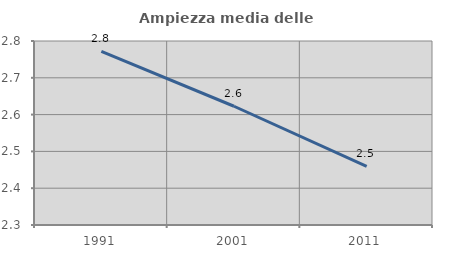
| Category | Ampiezza media delle famiglie |
|---|---|
| 1991.0 | 2.772 |
| 2001.0 | 2.623 |
| 2011.0 | 2.459 |